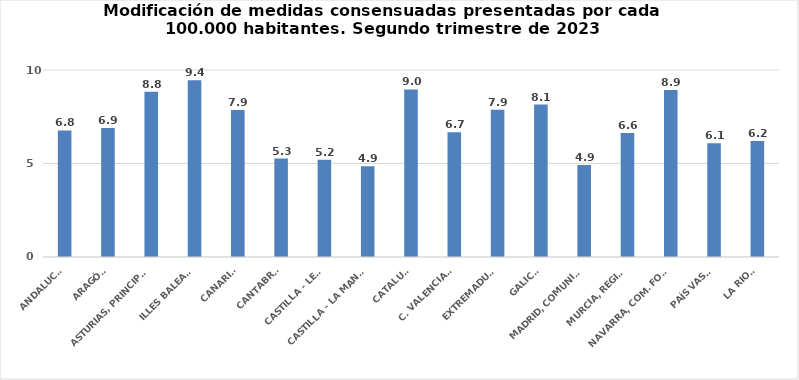
| Category | Series 0 |
|---|---|
| ANDALUCÍA | 6.769 |
| ARAGÓN | 6.892 |
| ASTURIAS, PRINCIPADO | 8.842 |
| ILLES BALEARS | 9.447 |
| CANARIAS | 7.863 |
| CANTABRIA | 5.267 |
| CASTILLA - LEÓN | 5.204 |
| CASTILLA - LA MANCHA | 4.854 |
| CATALUÑA | 8.963 |
| C. VALENCIANA | 6.669 |
| EXTREMADURA | 7.872 |
| GALICIA | 8.149 |
| MADRID, COMUNIDAD | 4.92 |
| MURCIA, REGIÓN | 6.634 |
| NAVARRA, COM. FORAL | 8.926 |
| PAÍS VASCO | 6.081 |
| LA RIOJA | 6.206 |